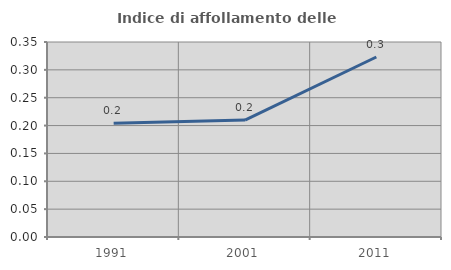
| Category | Indice di affollamento delle abitazioni  |
|---|---|
| 1991.0 | 0.204 |
| 2001.0 | 0.21 |
| 2011.0 | 0.323 |